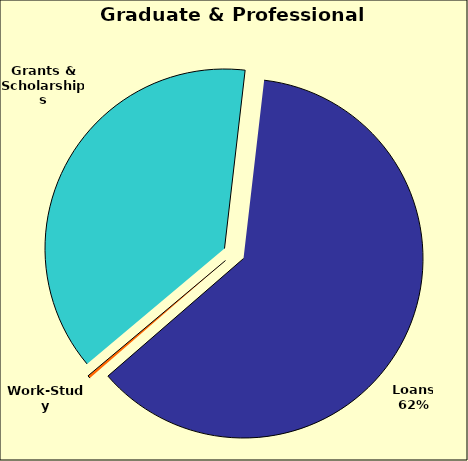
| Category | Series 0 |
|---|---|
| Grants & Scholarships | 0.379 |
| Loans | 0.618 |
| Work-Study | 0.003 |